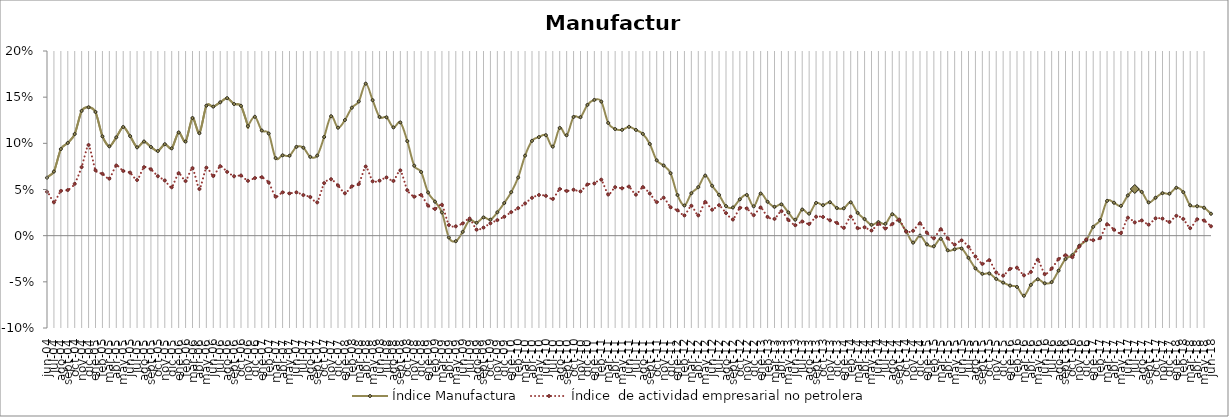
| Category | Índice Manufactura | Índice  de actividad empresarial no petrolera |
|---|---|---|
| 2004-01-01 | 0.029 | 0.02 |
| 2004-02-01 | 0.07 | 0.033 |
| 2004-03-01 | 0.098 | 0.056 |
| 2004-04-01 | 0.096 | 0.042 |
| 2004-05-01 | 0.048 | 0.034 |
| 2004-06-01 | 0.063 | 0.048 |
| 2004-07-01 | 0.069 | 0.036 |
| 2004-08-01 | 0.094 | 0.048 |
| 2004-09-01 | 0.1 | 0.049 |
| 2004-10-01 | 0.11 | 0.056 |
| 2004-11-01 | 0.135 | 0.074 |
| 2004-12-01 | 0.139 | 0.098 |
| 2005-01-01 | 0.134 | 0.071 |
| 2005-02-01 | 0.108 | 0.067 |
| 2005-03-01 | 0.097 | 0.062 |
| 2005-04-01 | 0.106 | 0.076 |
| 2005-05-01 | 0.118 | 0.07 |
| 2005-06-01 | 0.108 | 0.068 |
| 2005-07-01 | 0.096 | 0.06 |
| 2005-08-01 | 0.102 | 0.074 |
| 2005-09-01 | 0.096 | 0.072 |
| 2005-10-01 | 0.092 | 0.064 |
| 2005-11-01 | 0.099 | 0.06 |
| 2005-12-01 | 0.095 | 0.052 |
| 2006-01-01 | 0.112 | 0.068 |
| 2006-02-01 | 0.102 | 0.059 |
| 2006-03-01 | 0.127 | 0.073 |
| 2006-04-01 | 0.111 | 0.051 |
| 2006-05-01 | 0.141 | 0.074 |
| 2006-06-01 | 0.14 | 0.065 |
| 2006-07-01 | 0.144 | 0.075 |
| 2006-08-01 | 0.149 | 0.069 |
| 2006-09-01 | 0.143 | 0.064 |
| 2006-10-01 | 0.141 | 0.065 |
| 2006-11-01 | 0.119 | 0.059 |
| 2006-12-01 | 0.129 | 0.062 |
| 2007-01-01 | 0.114 | 0.063 |
| 2007-02-01 | 0.111 | 0.058 |
| 2007-03-01 | 0.084 | 0.042 |
| 2007-04-01 | 0.087 | 0.047 |
| 2007-05-01 | 0.087 | 0.046 |
| 2007-06-01 | 0.096 | 0.047 |
| 2007-07-01 | 0.095 | 0.044 |
| 2007-08-01 | 0.085 | 0.042 |
| 2007-09-01 | 0.087 | 0.036 |
| 2007-10-01 | 0.107 | 0.057 |
| 2007-11-01 | 0.129 | 0.061 |
| 2007-12-01 | 0.117 | 0.054 |
| 2008-01-01 | 0.125 | 0.046 |
| 2008-02-01 | 0.139 | 0.053 |
| 2008-03-01 | 0.145 | 0.056 |
| 2008-04-01 | 0.165 | 0.075 |
| 2008-05-01 | 0.147 | 0.059 |
| 2008-06-01 | 0.128 | 0.06 |
| 2008-07-01 | 0.128 | 0.063 |
| 2008-08-01 | 0.117 | 0.059 |
| 2008-09-01 | 0.123 | 0.071 |
| 2008-10-01 | 0.102 | 0.049 |
| 2008-11-01 | 0.076 | 0.042 |
| 2008-12-01 | 0.069 | 0.044 |
| 2009-01-01 | 0.047 | 0.033 |
| 2009-02-01 | 0.037 | 0.029 |
| 2009-03-01 | 0.025 | 0.033 |
| 2009-04-01 | -0.002 | 0.012 |
| 2009-05-01 | -0.006 | 0.01 |
| 2009-06-01 | 0.004 | 0.013 |
| 2009-07-01 | 0.017 | 0.019 |
| 2009-08-01 | 0.014 | 0.006 |
| 2009-09-01 | 0.02 | 0.009 |
| 2009-10-01 | 0.017 | 0.013 |
| 2009-11-01 | 0.025 | 0.017 |
| 2009-12-01 | 0.035 | 0.02 |
| 2010-01-01 | 0.047 | 0.026 |
| 2010-02-01 | 0.063 | 0.03 |
| 2010-03-01 | 0.087 | 0.035 |
| 2010-04-01 | 0.103 | 0.041 |
| 2010-05-01 | 0.107 | 0.044 |
| 2010-06-01 | 0.109 | 0.043 |
| 2010-07-01 | 0.096 | 0.04 |
| 2010-08-01 | 0.117 | 0.051 |
| 2010-09-01 | 0.109 | 0.048 |
| 2010-10-01 | 0.129 | 0.05 |
| 2010-11-01 | 0.128 | 0.048 |
| 2010-12-01 | 0.142 | 0.055 |
| 2011-01-01 | 0.147 | 0.057 |
| 2011-02-01 | 0.145 | 0.061 |
| 2011-03-01 | 0.122 | 0.045 |
| 2011-04-01 | 0.115 | 0.053 |
| 2011-05-01 | 0.115 | 0.051 |
| 2011-06-01 | 0.118 | 0.053 |
| 2011-07-01 | 0.115 | 0.044 |
| 2011-08-01 | 0.11 | 0.053 |
| 2011-09-01 | 0.099 | 0.046 |
| 2011-10-01 | 0.082 | 0.036 |
| 2011-11-01 | 0.076 | 0.041 |
| 2011-12-01 | 0.068 | 0.031 |
| 2012-01-01 | 0.044 | 0.028 |
| 2012-02-01 | 0.033 | 0.022 |
| 2012-03-01 | 0.046 | 0.032 |
| 2012-04-01 | 0.053 | 0.022 |
| 2012-05-01 | 0.065 | 0.037 |
| 2012-06-01 | 0.054 | 0.028 |
| 2012-07-01 | 0.044 | 0.033 |
| 2012-08-01 | 0.032 | 0.024 |
| 2012-09-01 | 0.031 | 0.018 |
| 2012-10-01 | 0.039 | 0.03 |
| 2012-11-01 | 0.044 | 0.03 |
| 2012-12-01 | 0.032 | 0.022 |
| 2013-01-01 | 0.046 | 0.031 |
| 2013-02-01 | 0.037 | 0.02 |
| 2013-03-01 | 0.031 | 0.018 |
| 2013-04-01 | 0.034 | 0.027 |
| 2013-05-01 | 0.025 | 0.017 |
| 2013-06-01 | 0.017 | 0.011 |
| 2013-07-01 | 0.028 | 0.015 |
| 2013-08-01 | 0.024 | 0.013 |
| 2013-09-01 | 0.035 | 0.021 |
| 2013-10-01 | 0.033 | 0.02 |
| 2013-11-01 | 0.036 | 0.017 |
| 2013-12-01 | 0.03 | 0.014 |
| 2014-01-01 | 0.03 | 0.008 |
| 2014-02-01 | 0.036 | 0.021 |
| 2014-03-01 | 0.025 | 0.008 |
| 2014-04-01 | 0.018 | 0.009 |
| 2014-05-01 | 0.012 | 0.006 |
| 2014-06-01 | 0.015 | 0.013 |
| 2014-07-01 | 0.013 | 0.008 |
| 2014-08-01 | 0.023 | 0.013 |
| 2014-09-01 | 0.016 | 0.017 |
| 2014-10-01 | 0.005 | 0.004 |
| 2014-11-01 | -0.008 | 0.005 |
| 2014-12-01 | 0 | 0.013 |
| 2015-01-01 | -0.009 | 0.003 |
| 2015-02-01 | -0.012 | -0.003 |
| 2015-03-01 | -0.003 | 0.007 |
| 2015-04-01 | -0.016 | -0.003 |
| 2015-05-01 | -0.015 | -0.01 |
| 2015-06-01 | -0.014 | -0.005 |
| 2015-07-01 | -0.024 | -0.012 |
| 2015-08-01 | -0.035 | -0.023 |
| 2015-09-01 | -0.041 | -0.031 |
| 2015-10-01 | -0.041 | -0.026 |
| 2015-11-01 | -0.047 | -0.04 |
| 2015-12-01 | -0.051 | -0.043 |
| 2016-01-01 | -0.054 | -0.036 |
| 2016-02-01 | -0.056 | -0.035 |
| 2016-03-01 | -0.065 | -0.043 |
| 2016-04-01 | -0.053 | -0.039 |
| 2016-05-01 | -0.047 | -0.026 |
| 2016-06-01 | -0.052 | -0.042 |
| 2016-07-01 | -0.05 | -0.036 |
| 2016-08-01 | -0.038 | -0.025 |
| 2016-09-01 | -0.025 | -0.021 |
| 2016-10-01 | -0.021 | -0.023 |
| 2016-11-01 | -0.011 | -0.012 |
| 2016-12-01 | -0.005 | -0.004 |
| 2017-01-01 | 0.01 | -0.005 |
| 2017-02-01 | 0.017 | -0.003 |
| 2017-03-01 | 0.038 | 0.012 |
| 2017-04-01 | 0.036 | 0.007 |
| 2017-05-01 | 0.032 | 0.003 |
| 2017-06-01 | 0.044 | 0.019 |
| 2017-07-01 | 0.051 | 0.014 |
| 2017-08-01 | 0.047 | 0.016 |
| 2017-09-01 | 0.036 | 0.012 |
| 2017-10-01 | 0.041 | 0.019 |
| 2017-11-01 | 0.046 | 0.018 |
| 2017-12-01 | 0.045 | 0.015 |
| 2018-01-01 | 0.052 | 0.021 |
| 2018-02-01 | 0.047 | 0.018 |
| 2018-03-01 | 0.033 | 0.008 |
| 2018-04-01 | 0.032 | 0.018 |
| 2018-05-01 | 0.03 | 0.016 |
| 2018-06-01 | 0.024 | 0.01 |